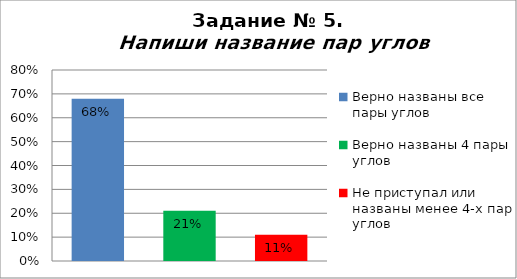
| Category | Напиши название пар углов |
|---|---|
| Верно названы все пары углов | 0.68 |
| Верно названы 4 пары углов | 0.21 |
| Не приступал или названы менее 4-х пар углов | 0.11 |